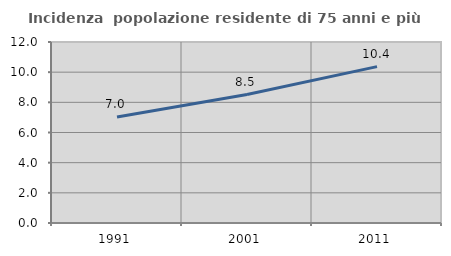
| Category | Incidenza  popolazione residente di 75 anni e più |
|---|---|
| 1991.0 | 7.031 |
| 2001.0 | 8.515 |
| 2011.0 | 10.368 |